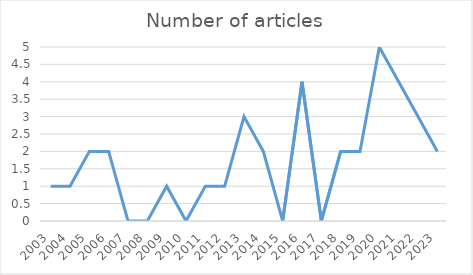
| Category | Number of articles |
|---|---|
| 2003 | 1 |
| 2004 | 1 |
| 2005 | 2 |
| 2006 | 2 |
| 2007 | 0 |
| 2008 | 0 |
| 2009 | 1 |
| 2010 | 0 |
| 2011 | 1 |
| 2012 | 1 |
| 2013 | 3 |
| 2014 | 2 |
| 2015 | 0 |
| 2016 | 4 |
| 2017 | 0 |
| 2018 | 2 |
| 2019 | 2 |
| 2020 | 5 |
| 2021 | 4 |
| 2022 | 3 |
| 2023 | 2 |